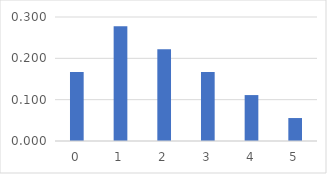
| Category | Series 0 |
|---|---|
| 0.0 | 0.167 |
| 1.0 | 0.278 |
| 2.0 | 0.222 |
| 3.0 | 0.167 |
| 4.0 | 0.111 |
| 5.0 | 0.056 |